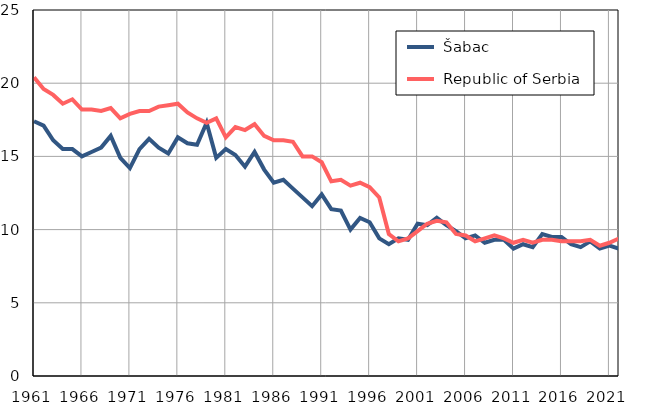
| Category |  Šabac |  Republic of Serbia |
|---|---|---|
| 1961.0 | 17.4 | 20.4 |
| 1962.0 | 17.1 | 19.6 |
| 1963.0 | 16.1 | 19.2 |
| 1964.0 | 15.5 | 18.6 |
| 1965.0 | 15.5 | 18.9 |
| 1966.0 | 15 | 18.2 |
| 1967.0 | 15.3 | 18.2 |
| 1968.0 | 15.6 | 18.1 |
| 1969.0 | 16.4 | 18.3 |
| 1970.0 | 14.9 | 17.6 |
| 1971.0 | 14.2 | 17.9 |
| 1972.0 | 15.5 | 18.1 |
| 1973.0 | 16.2 | 18.1 |
| 1974.0 | 15.6 | 18.4 |
| 1975.0 | 15.2 | 18.5 |
| 1976.0 | 16.3 | 18.6 |
| 1977.0 | 15.9 | 18 |
| 1978.0 | 15.8 | 17.6 |
| 1979.0 | 17.3 | 17.3 |
| 1980.0 | 14.9 | 17.6 |
| 1981.0 | 15.5 | 16.3 |
| 1982.0 | 15.1 | 17 |
| 1983.0 | 14.3 | 16.8 |
| 1984.0 | 15.3 | 17.2 |
| 1985.0 | 14.1 | 16.4 |
| 1986.0 | 13.2 | 16.1 |
| 1987.0 | 13.4 | 16.1 |
| 1988.0 | 12.8 | 16 |
| 1989.0 | 12.2 | 15 |
| 1990.0 | 11.6 | 15 |
| 1991.0 | 12.4 | 14.6 |
| 1992.0 | 11.4 | 13.3 |
| 1993.0 | 11.3 | 13.4 |
| 1994.0 | 10 | 13 |
| 1995.0 | 10.8 | 13.2 |
| 1996.0 | 10.5 | 12.9 |
| 1997.0 | 9.4 | 12.2 |
| 1998.0 | 9 | 9.7 |
| 1999.0 | 9.4 | 9.2 |
| 2000.0 | 9.3 | 9.4 |
| 2001.0 | 10.4 | 9.9 |
| 2002.0 | 10.3 | 10.4 |
| 2003.0 | 10.8 | 10.6 |
| 2004.0 | 10.3 | 10.5 |
| 2005.0 | 9.9 | 9.7 |
| 2006.0 | 9.4 | 9.6 |
| 2007.0 | 9.6 | 9.2 |
| 2008.0 | 9.1 | 9.4 |
| 2009.0 | 9.3 | 9.6 |
| 2010.0 | 9.3 | 9.4 |
| 2011.0 | 8.7 | 9.1 |
| 2012.0 | 9 | 9.3 |
| 2013.0 | 8.8 | 9.1 |
| 2014.0 | 9.7 | 9.3 |
| 2015.0 | 9.5 | 9.3 |
| 2016.0 | 9.5 | 9.2 |
| 2017.0 | 9 | 9.2 |
| 2018.0 | 8.8 | 9.2 |
| 2019.0 | 9.2 | 9.3 |
| 2020.0 | 8.7 | 8.9 |
| 2021.0 | 8.9 | 9.1 |
| 2022.0 | 8.7 | 9.4 |